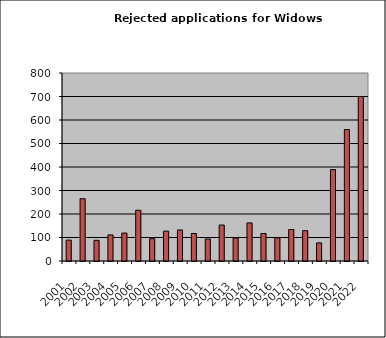
| Category | Series 0 |
|---|---|
| 2001.0 | 89 |
| 2002.0 | 265 |
| 2003.0 | 88 |
| 2004.0 | 111 |
| 2005.0 | 119 |
| 2006.0 | 216 |
| 2007.0 | 95 |
| 2008.0 | 127 |
| 2009.0 | 132 |
| 2010.0 | 117 |
| 2011.0 | 94 |
| 2012.0 | 153 |
| 2013.0 | 98 |
| 2014.0 | 162 |
| 2015.0 | 117 |
| 2016.0 | 99 |
| 2017.0 | 134 |
| 2018.0 | 129 |
| 2019.0 | 77 |
| 2020.0 | 389 |
| 2021.0 | 559 |
| 2022.0 | 700 |